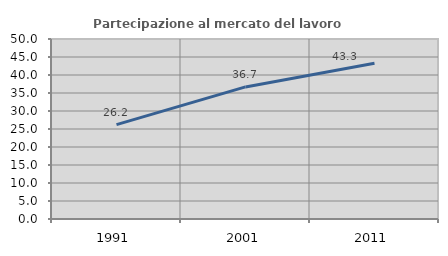
| Category | Partecipazione al mercato del lavoro  femminile |
|---|---|
| 1991.0 | 26.23 |
| 2001.0 | 36.689 |
| 2011.0 | 43.271 |